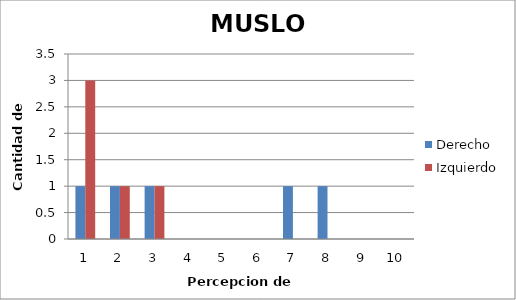
| Category | Derecho  | Izquierdo |
|---|---|---|
| 0 | 1 | 3 |
| 1 | 1 | 1 |
| 2 | 1 | 1 |
| 3 | 0 | 0 |
| 4 | 0 | 0 |
| 5 | 0 | 0 |
| 6 | 1 | 0 |
| 7 | 1 | 0 |
| 8 | 0 | 0 |
| 9 | 0 | 0 |